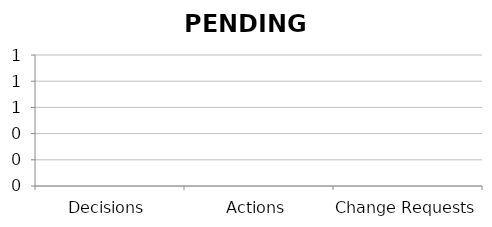
| Category | Series 0 |
|---|---|
| Decisions | 0 |
| Actions | 0 |
| Change Requests  | 0 |